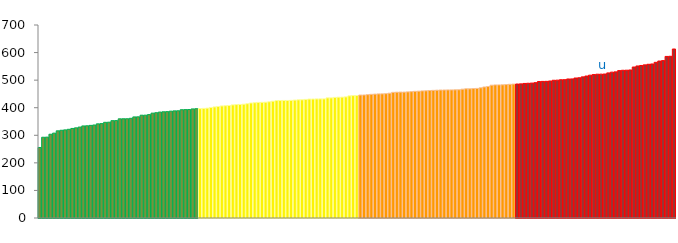
| Category | Top Quartile | 2nd Quartile | 3rd Quartile | Bottom Quartile | Series 4 |
|---|---|---|---|---|---|
|  | 255.7 | 0 | 0 | 0 | 255.7 |
|  | 292.9 | 0 | 0 | 0 | 292.9 |
|  | 293.3 | 0 | 0 | 0 | 293.3 |
|  | 303.8 | 0 | 0 | 0 | 303.8 |
|  | 307.8 | 0 | 0 | 0 | 307.8 |
|  | 316.2 | 0 | 0 | 0 | 316.2 |
|  | 318.2 | 0 | 0 | 0 | 318.2 |
|  | 319.6 | 0 | 0 | 0 | 319.6 |
|  | 321.7 | 0 | 0 | 0 | 321.7 |
|  | 324.8 | 0 | 0 | 0 | 324.8 |
|  | 327 | 0 | 0 | 0 | 327 |
|  | 329.8 | 0 | 0 | 0 | 329.8 |
|  | 333.9 | 0 | 0 | 0 | 333.9 |
|  | 334.5 | 0 | 0 | 0 | 334.5 |
|  | 335.9 | 0 | 0 | 0 | 335.9 |
|  | 337.4 | 0 | 0 | 0 | 337.4 |
|  | 341.5 | 0 | 0 | 0 | 341.5 |
|  | 342.4 | 0 | 0 | 0 | 342.4 |
|  | 347 | 0 | 0 | 0 | 347 |
|  | 347.5 | 0 | 0 | 0 | 347.5 |
|  | 353 | 0 | 0 | 0 | 353 |
|  | 353.3 | 0 | 0 | 0 | 353.3 |
|  | 359.7 | 0 | 0 | 0 | 359.7 |
|  | 359.9 | 0 | 0 | 0 | 359.9 |
|  | 360 | 0 | 0 | 0 | 360 |
|  | 361.6 | 0 | 0 | 0 | 361.6 |
|  | 366.6 | 0 | 0 | 0 | 366.6 |
|  | 367 | 0 | 0 | 0 | 367 |
|  | 372.8 | 0 | 0 | 0 | 372.8 |
|  | 373 | 0 | 0 | 0 | 373 |
|  | 375.1 | 0 | 0 | 0 | 375.1 |
|  | 380.3 | 0 | 0 | 0 | 380.3 |
|  | 381.9 | 0 | 0 | 0 | 381.9 |
|  | 384.2 | 0 | 0 | 0 | 384.2 |
|  | 385.2 | 0 | 0 | 0 | 385.2 |
|  | 385.8 | 0 | 0 | 0 | 385.8 |
|  | 387.5 | 0 | 0 | 0 | 387.5 |
|  | 388.5 | 0 | 0 | 0 | 388.5 |
|  | 388.9 | 0 | 0 | 0 | 388.9 |
|  | 392.7 | 0 | 0 | 0 | 392.7 |
|  | 393.1 | 0 | 0 | 0 | 393.1 |
|  | 393.4 | 0 | 0 | 0 | 393.4 |
|  | 395.6 | 0 | 0 | 0 | 395.6 |
|  | 396.4 | 0 | 0 | 0 | 396.4 |
|  | 0 | 396.7 | 0 | 0 | 396.7 |
|  | 0 | 397.6 | 0 | 0 | 397.6 |
|  | 0 | 398.5 | 0 | 0 | 398.5 |
|  | 0 | 400.9 | 0 | 0 | 400.9 |
|  | 0 | 402.9 | 0 | 0 | 402.9 |
|  | 0 | 404.5 | 0 | 0 | 404.5 |
|  | 0 | 406.5 | 0 | 0 | 406.5 |
|  | 0 | 407.2 | 0 | 0 | 407.2 |
|  | 0 | 408.1 | 0 | 0 | 408.1 |
|  | 0 | 410.2 | 0 | 0 | 410.2 |
|  | 0 | 411.3 | 0 | 0 | 411.3 |
|  | 0 | 411.8 | 0 | 0 | 411.8 |
|  | 0 | 412.8 | 0 | 0 | 412.8 |
|  | 0 | 414.5 | 0 | 0 | 414.5 |
|  | 0 | 417.1 | 0 | 0 | 417.1 |
|  | 0 | 418.1 | 0 | 0 | 418.1 |
|  | 0 | 419.4 | 0 | 0 | 419.4 |
|  | 0 | 419.6 | 0 | 0 | 419.6 |
|  | 0 | 420.1 | 0 | 0 | 420.1 |
|  | 0 | 421.5 | 0 | 0 | 421.5 |
|  | 0 | 423.7 | 0 | 0 | 423.7 |
|  | 0 | 425.9 | 0 | 0 | 425.9 |
|  | 0 | 426 | 0 | 0 | 426 |
|  | 0 | 426.3 | 0 | 0 | 426.3 |
|  | 0 | 426.3 | 0 | 0 | 426.3 |
|  | 0 | 426.7 | 0 | 0 | 426.7 |
|  | 0 | 427.7 | 0 | 0 | 427.7 |
|  | 0 | 428.6 | 0 | 0 | 428.6 |
|  | 0 | 428.8 | 0 | 0 | 428.8 |
|  | 0 | 430.1 | 0 | 0 | 430.1 |
|  | 0 | 431.4 | 0 | 0 | 431.4 |
|  | 0 | 431.5 | 0 | 0 | 431.5 |
|  | 0 | 431.8 | 0 | 0 | 431.8 |
|  | 0 | 431.9 | 0 | 0 | 431.9 |
|  | 0 | 432 | 0 | 0 | 432 |
|  | 0 | 435.7 | 0 | 0 | 435.7 |
|  | 0 | 435.7 | 0 | 0 | 435.7 |
|  | 0 | 437.5 | 0 | 0 | 437.5 |
|  | 0 | 438.2 | 0 | 0 | 438.2 |
|  | 0 | 438.4 | 0 | 0 | 438.4 |
|  | 0 | 439.3 | 0 | 0 | 439.3 |
|  | 0 | 443 | 0 | 0 | 443 |
|  | 0 | 443.9 | 0 | 0 | 443.9 |
|  | 0 | 444.3 | 0 | 0 | 444.3 |
|  | 0 | 0 | 445.9 | 0 | 445.9 |
|  | 0 | 0 | 446.2 | 0 | 446.2 |
|  | 0 | 0 | 447.3 | 0 | 447.3 |
|  | 0 | 0 | 448.5 | 0 | 448.5 |
|  | 0 | 0 | 449.4 | 0 | 449.4 |
|  | 0 | 0 | 450 | 0 | 450 |
|  | 0 | 0 | 450.2 | 0 | 450.2 |
|  | 0 | 0 | 450.9 | 0 | 450.9 |
|  | 0 | 0 | 452.6 | 0 | 452.6 |
|  | 0 | 0 | 455.7 | 0 | 455.7 |
|  | 0 | 0 | 456.3 | 0 | 456.3 |
|  | 0 | 0 | 456.6 | 0 | 456.6 |
|  | 0 | 0 | 456.6 | 0 | 456.6 |
|  | 0 | 0 | 457.4 | 0 | 457.4 |
|  | 0 | 0 | 458.2 | 0 | 458.2 |
|  | 0 | 0 | 459.4 | 0 | 459.4 |
|  | 0 | 0 | 460 | 0 | 460 |
|  | 0 | 0 | 461 | 0 | 461 |
|  | 0 | 0 | 461.3 | 0 | 461.3 |
|  | 0 | 0 | 462.4 | 0 | 462.4 |
|  | 0 | 0 | 462.9 | 0 | 462.9 |
|  | 0 | 0 | 463.6 | 0 | 463.6 |
|  | 0 | 0 | 464.1 | 0 | 464.1 |
|  | 0 | 0 | 464.3 | 0 | 464.3 |
|  | 0 | 0 | 464.5 | 0 | 464.5 |
|  | 0 | 0 | 464.6 | 0 | 464.6 |
|  | 0 | 0 | 464.8 | 0 | 464.8 |
|  | 0 | 0 | 465.1 | 0 | 465.1 |
|  | 0 | 0 | 467.3 | 0 | 467.3 |
|  | 0 | 0 | 468.5 | 0 | 468.5 |
|  | 0 | 0 | 468.6 | 0 | 468.6 |
|  | 0 | 0 | 469.5 | 0 | 469.5 |
|  | 0 | 0 | 470 | 0 | 470 |
|  | 0 | 0 | 472.2 | 0 | 472.2 |
|  | 0 | 0 | 475.2 | 0 | 475.2 |
|  | 0 | 0 | 476.8 | 0 | 476.8 |
|  | 0 | 0 | 481.7 | 0 | 481.7 |
|  | 0 | 0 | 482.7 | 0 | 482.7 |
|  | 0 | 0 | 482.8 | 0 | 482.8 |
|  | 0 | 0 | 483 | 0 | 483 |
|  | 0 | 0 | 483.9 | 0 | 483.9 |
|  | 0 | 0 | 484.9 | 0 | 484.9 |
|  | 0 | 0 | 485.6 | 0 | 485.6 |
|  | 0 | 0 | 0 | 485.9 | 485.9 |
|  | 0 | 0 | 0 | 486.5 | 486.5 |
|  | 0 | 0 | 0 | 488 | 488 |
|  | 0 | 0 | 0 | 488.7 | 488.7 |
|  | 0 | 0 | 0 | 489.3 | 489.3 |
|  | 0 | 0 | 0 | 490.9 | 490.9 |
|  | 0 | 0 | 0 | 495 | 495 |
|  | 0 | 0 | 0 | 495.4 | 495.4 |
|  | 0 | 0 | 0 | 495.6 | 495.6 |
|  | 0 | 0 | 0 | 496.9 | 496.9 |
|  | 0 | 0 | 0 | 499.5 | 499.5 |
|  | 0 | 0 | 0 | 500 | 500 |
|  | 0 | 0 | 0 | 501.5 | 501.5 |
|  | 0 | 0 | 0 | 501.7 | 501.7 |
|  | 0 | 0 | 0 | 504.3 | 504.3 |
|  | 0 | 0 | 0 | 504.4 | 504.4 |
|  | 0 | 0 | 0 | 507.7 | 507.7 |
|  | 0 | 0 | 0 | 508.7 | 508.7 |
|  | 0 | 0 | 0 | 511.9 | 511.9 |
|  | 0 | 0 | 0 | 514.9 | 514.9 |
|  | 0 | 0 | 0 | 518 | 518 |
|  | 0 | 0 | 0 | 520.2 | 520.2 |
|  | 0 | 0 | 0 | 521.5 | 521.5 |
|  | 0 | 0 | 0 | 521.8 | 521.8 |
| u | 0 | 0 | 0 | 522.2 | 522.2 |